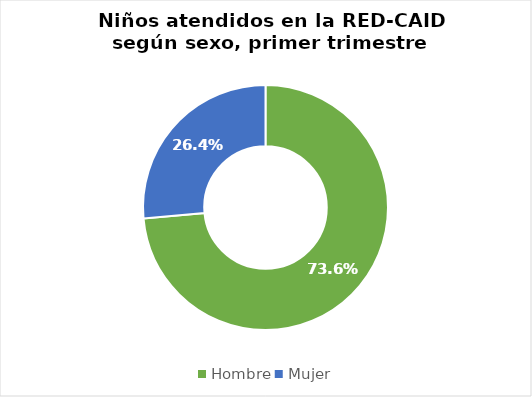
| Category | Cantidad |
|---|---|
| Hombre | 1665 |
| Mujer | 598 |